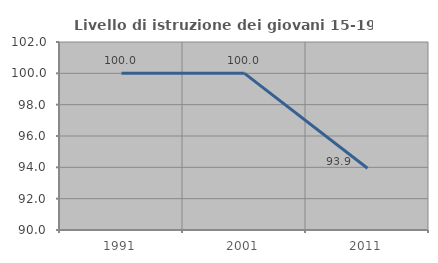
| Category | Livello di istruzione dei giovani 15-19 anni |
|---|---|
| 1991.0 | 100 |
| 2001.0 | 100 |
| 2011.0 | 93.939 |